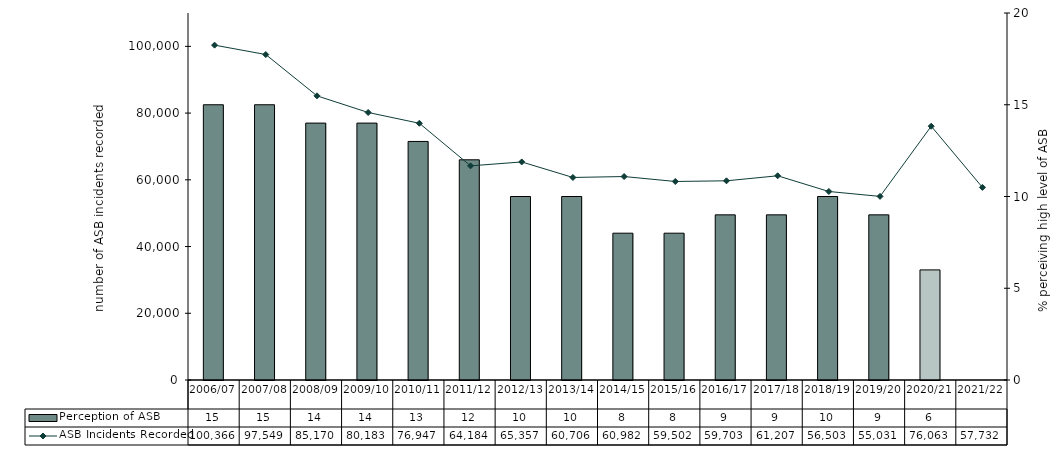
| Category | Perception of ASB |
|---|---|
| 2006/07 | 15 |
| 2007/08 | 15 |
| 2008/09 | 14 |
| 2009/10 | 14 |
| 2010/11 | 13 |
| 2011/12 | 12 |
| 2012/13 | 10 |
| 2013/14 | 10 |
| 2014/15 | 8 |
| 2015/16 | 8 |
| 2016/17 | 9 |
| 2017/18 | 9 |
| 2018/19 | 10 |
| 2019/20 | 9 |